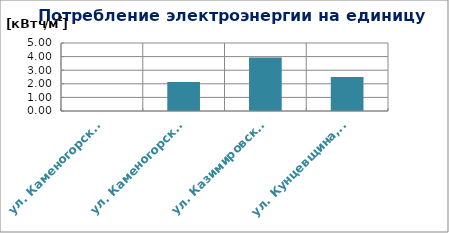
| Category | Series 0 |
|---|---|
| ул. Каменогорская, 30 | 0 |
| ул. Каменогорская, 86 | 2.14 |
| ул. Казимировская, 9 | 3.935 |
| ул. Кунцевщина, 35 | 2.507 |